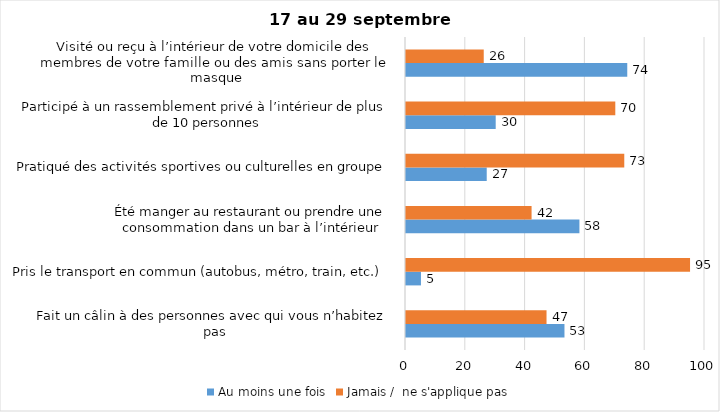
| Category | Au moins une fois | Jamais /  ne s'applique pas |
|---|---|---|
| Fait un câlin à des personnes avec qui vous n’habitez pas | 53 | 47 |
| Pris le transport en commun (autobus, métro, train, etc.) | 5 | 95 |
| Été manger au restaurant ou prendre une consommation dans un bar à l’intérieur | 58 | 42 |
| Pratiqué des activités sportives ou culturelles en groupe | 27 | 73 |
| Participé à un rassemblement privé à l’intérieur de plus de 10 personnes | 30 | 70 |
| Visité ou reçu à l’intérieur de votre domicile des membres de votre famille ou des amis sans porter le masque | 74 | 26 |